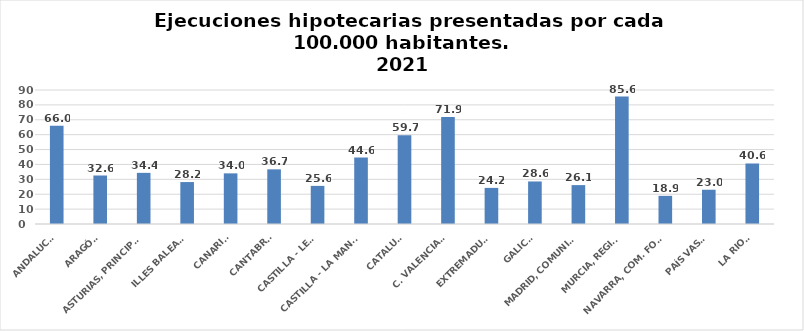
| Category | Series 0 |
|---|---|
| ANDALUCÍA | 65.99 |
| ARAGÓN | 32.571 |
| ASTURIAS, PRINCIPADO | 34.355 |
| ILLES BALEARS | 28.168 |
| CANARIAS | 34.008 |
| CANTABRIA | 36.713 |
| CASTILLA - LEÓN | 25.596 |
| CASTILLA - LA MANCHA | 44.592 |
| CATALUÑA | 59.675 |
| C. VALENCIANA | 71.895 |
| EXTREMADURA | 24.248 |
| GALICIA | 28.573 |
| MADRID, COMUNIDAD | 26.121 |
| MURCIA, REGIÓN | 85.558 |
| NAVARRA, COM. FORAL | 18.905 |
| PAÍS VASCO | 23.013 |
| LA RIOJA | 40.636 |